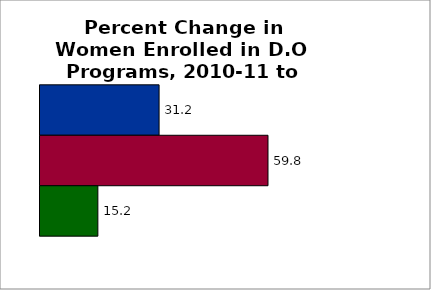
| Category | 50 states and D.C. | SREB states | State |
|---|---|---|---|
| 0 | 31.22 | 59.775 | 15.169 |